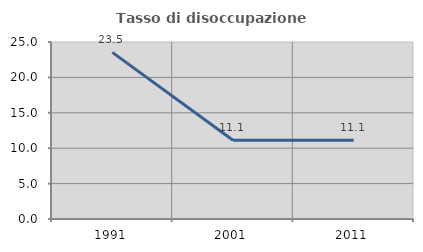
| Category | Tasso di disoccupazione giovanile  |
|---|---|
| 1991.0 | 23.529 |
| 2001.0 | 11.111 |
| 2011.0 | 11.111 |